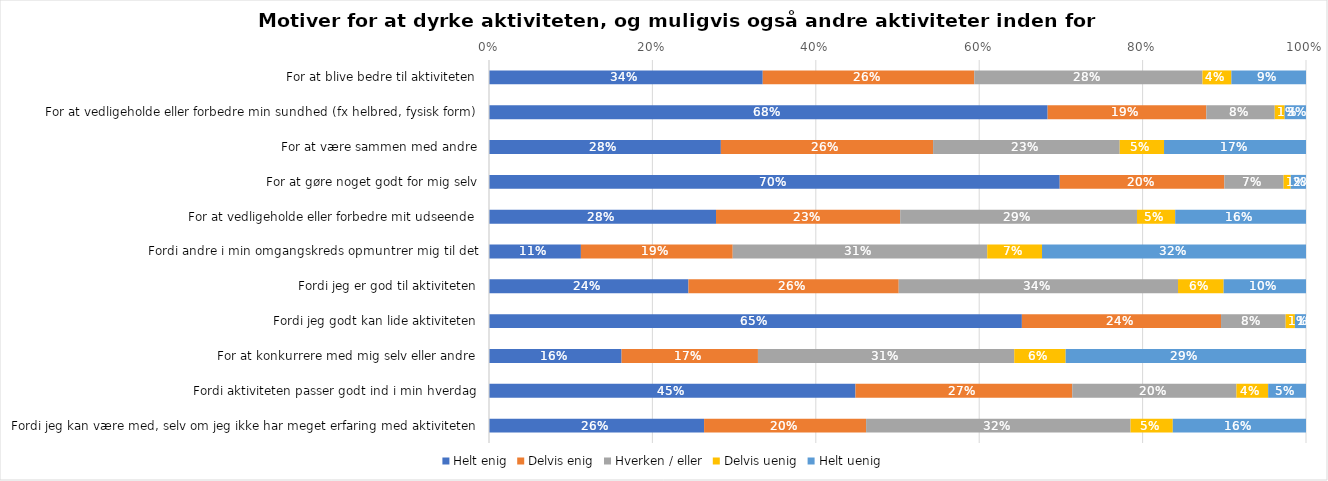
| Category | Helt enig | Delvis enig | Hverken / eller | Delvis uenig | Helt uenig |
|---|---|---|---|---|---|
| For at blive bedre til aktiviteten | 0.335 | 0.259 | 0.279 | 0.035 | 0.091 |
| For at vedligeholde eller forbedre min sundhed (fx helbred, fysisk form) | 0.684 | 0.194 | 0.084 | 0.012 | 0.026 |
| For at være sammen med andre | 0.284 | 0.26 | 0.228 | 0.054 | 0.174 |
| For at gøre noget godt for mig selv | 0.699 | 0.201 | 0.073 | 0.009 | 0.019 |
| For at vedligeholde eller forbedre mit udseende | 0.278 | 0.225 | 0.29 | 0.047 | 0.16 |
| Fordi andre i min omgangskreds opmuntrer mig til det | 0.112 | 0.186 | 0.312 | 0.067 | 0.323 |
| Fordi jeg er god til aktiviteten | 0.244 | 0.257 | 0.342 | 0.056 | 0.101 |
| Fordi jeg godt kan lide aktiviteten | 0.652 | 0.244 | 0.079 | 0.011 | 0.014 |
| For at konkurrere med mig selv eller andre | 0.162 | 0.167 | 0.314 | 0.063 | 0.294 |
| Fordi aktiviteten passer godt ind i min hverdag | 0.449 | 0.265 | 0.201 | 0.039 | 0.046 |
| Fordi jeg kan være med, selv om jeg ikke har meget erfaring med aktiviteten | 0.263 | 0.198 | 0.324 | 0.052 | 0.163 |